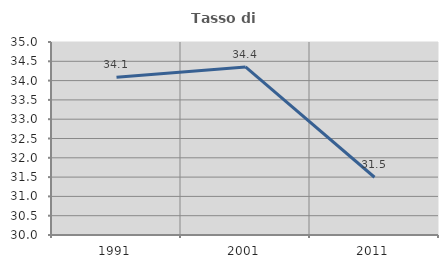
| Category | Tasso di occupazione   |
|---|---|
| 1991.0 | 34.089 |
| 2001.0 | 34.354 |
| 2011.0 | 31.496 |